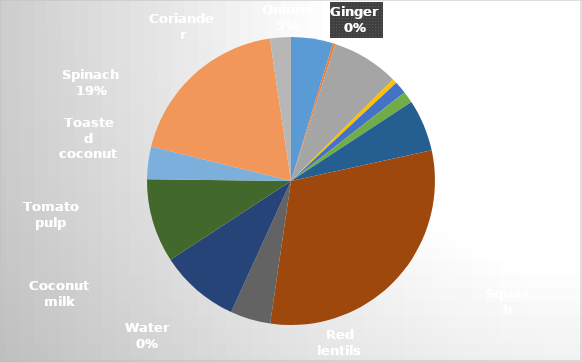
| Category | Series 0 |
|---|---|
| Onions | 0.896 |
| Ginger | 0.052 |
| Lemongrass | 1.438 |
| Garlic | 0.1 |
| Curry powder | 0.267 |
| Ground coriander | 0.245 |
| Potatoes | 1.111 |
| Squash | 5.85 |
| Red lentils | 0.86 |
| Water | 0 |
| Coconut milk | 1.707 |
| Tomato pulp | 1.789 |
| Toasted coconut | 0.695 |
| Spinach | 3.58 |
| Coriander | 0.448 |